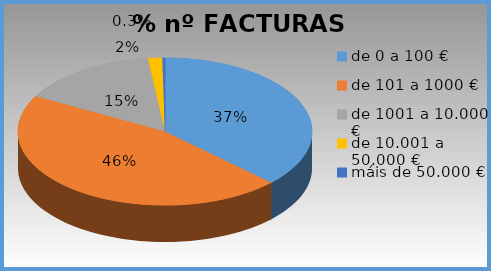
| Category | Series 0 |
|---|---|
| de 0 a 100 € | 0.372 |
| de 101 a 1000 € | 0.458 |
| de 1001 a 10.000 € | 0.152 |
| de 10.001 a 50.000 € | 0.016 |
| máis de 50.000 € | 0.003 |